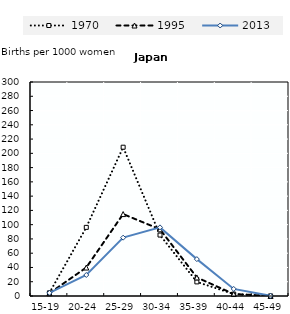
| Category | 1970 | 1995 | 2013 |
|---|---|---|---|
| 15-19 | 4.43 | 3.865 | 4.413 |
| 20-24 | 96.203 | 39.9 | 29.454 |
| 25-29 | 208.579 | 114.846 | 81.789 |
| 30-34 | 85.438 | 93.461 | 96.211 |
| 35-39 | 19.766 | 26.006 | 51.696 |
| 40-44 | 2.69 | 2.78 | 9.91 |
| 45-49 | 0.164 | 0.069 | 0.259 |